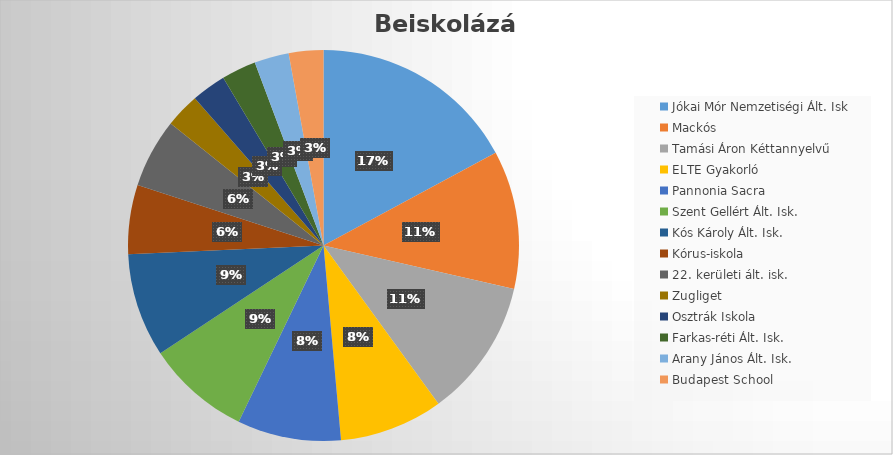
| Category | Series 0 |
|---|---|
| Jókai Mór Nemzetiségi Ált. Isk | 6 |
| Mackós | 4 |
| Tamási Áron Kéttannyelvű | 4 |
| ELTE Gyakorló | 3 |
| Pannonia Sacra | 3 |
| Szent Gellért Ált. Isk. | 3 |
| Kós Károly Ált. Isk. | 3 |
| Kórus-iskola | 2 |
| 22. kerületi ált. isk. | 2 |
| Zugliget | 1 |
| Osztrák Iskola | 1 |
| Farkas-réti Ált. Isk. | 1 |
| Arany János Ált. Isk. | 1 |
| Budapest School | 1 |